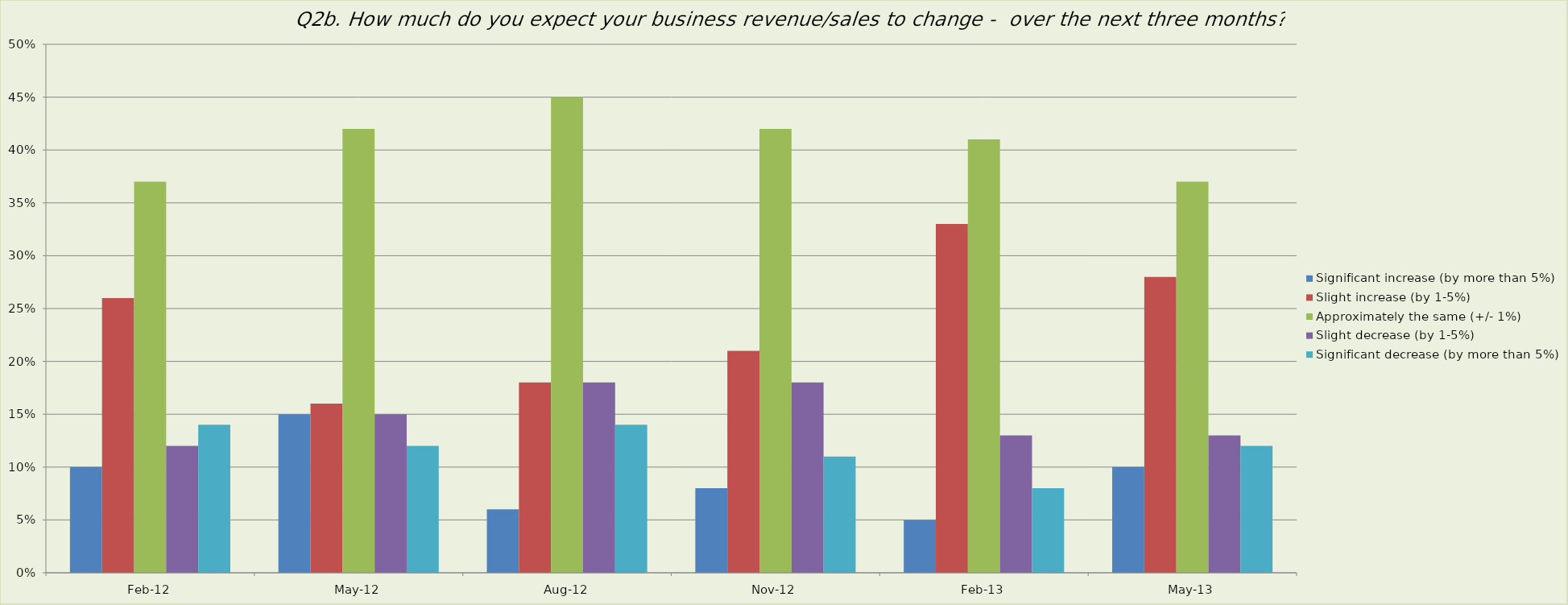
| Category | Significant increase (by more than 5%) | Slight increase (by 1-5%) | Approximately the same (+/- 1%) | Slight decrease (by 1-5%) | Significant decrease (by more than 5%) |
|---|---|---|---|---|---|
| 2012-02-01 | 0.1 | 0.26 | 0.37 | 0.12 | 0.14 |
| 2012-05-01 | 0.15 | 0.16 | 0.42 | 0.15 | 0.12 |
| 2012-08-01 | 0.06 | 0.18 | 0.45 | 0.18 | 0.14 |
| 2012-11-01 | 0.08 | 0.21 | 0.42 | 0.18 | 0.11 |
| 2013-02-01 | 0.05 | 0.33 | 0.41 | 0.13 | 0.08 |
| 2013-05-01 | 0.1 | 0.28 | 0.37 | 0.13 | 0.12 |